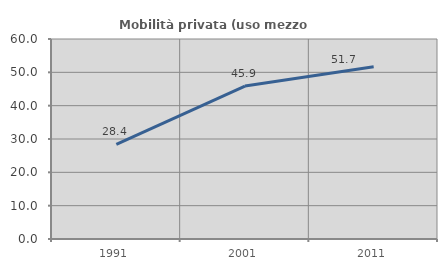
| Category | Mobilità privata (uso mezzo privato) |
|---|---|
| 1991.0 | 28.356 |
| 2001.0 | 45.887 |
| 2011.0 | 51.698 |